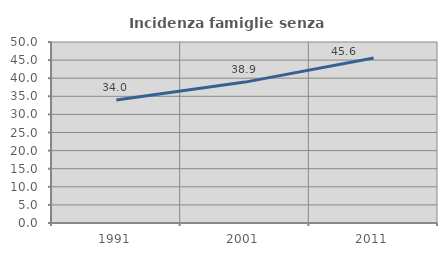
| Category | Incidenza famiglie senza nuclei |
|---|---|
| 1991.0 | 33.963 |
| 2001.0 | 38.92 |
| 2011.0 | 45.563 |